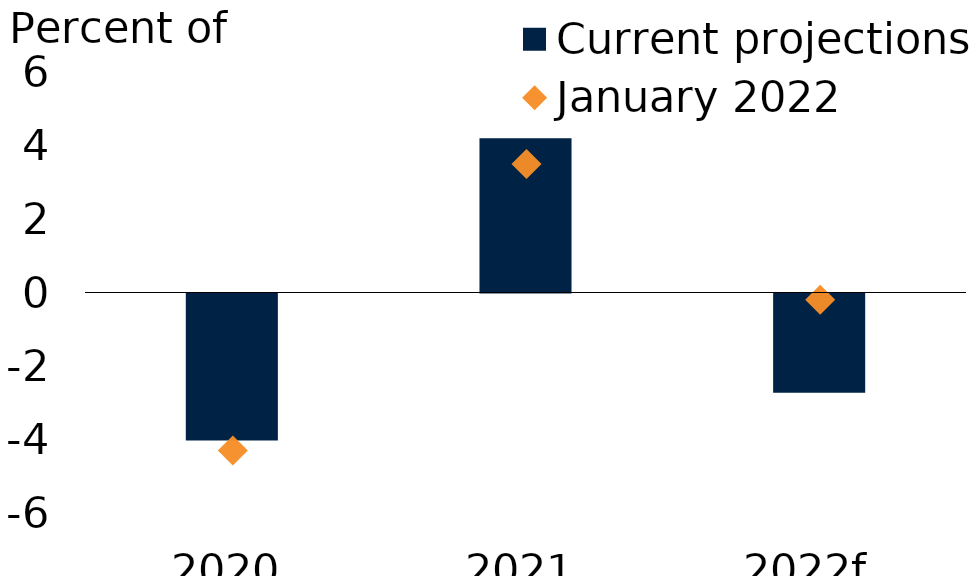
| Category | Current projections |
|---|---|
| 2020 | -4 |
| 2021 | 4.2 |
| 2022f  | -2.7 |